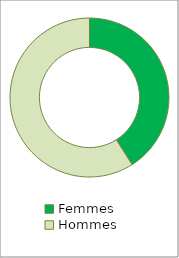
| Category | Series 0 |
|---|---|
| Femmes | 0.41 |
| Hommes | 0.59 |